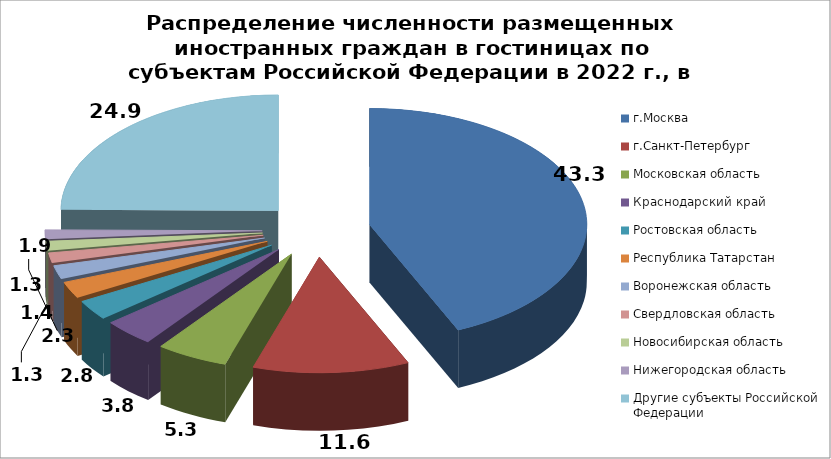
| Category | Series 0 |
|---|---|
| г.Москва | 43.307 |
| г.Санкт-Петербург | 11.625 |
| Московская область | 5.344 |
| Краснодарский край | 3.814 |
| Ростовская область | 2.813 |
| Республика Татарстан | 2.326 |
| Воронежская область | 1.91 |
| Свердловская область | 1.411 |
| Новосибирская область | 1.299 |
| Нижегородская область | 1.278 |
| Другие субъекты Российской Федерации | 24.873 |